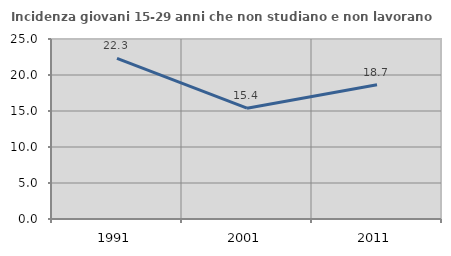
| Category | Incidenza giovani 15-29 anni che non studiano e non lavorano  |
|---|---|
| 1991.0 | 22.314 |
| 2001.0 | 15.395 |
| 2011.0 | 18.655 |